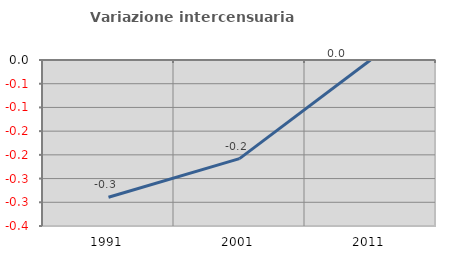
| Category | Variazione intercensuaria annua |
|---|---|
| 1991.0 | -0.289 |
| 2001.0 | -0.208 |
| 2011.0 | 0 |